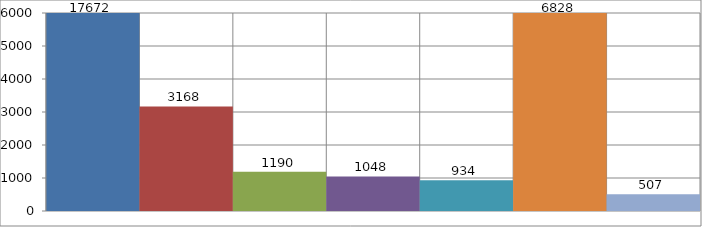
| Category | Series 0 |
|---|---|
| 0 | 17672 |
| 1 | 3168 |
| 2 | 1190 |
| 3 | 1048 |
| 4 | 934 |
| 5 | 6828 |
| 6 | 507 |